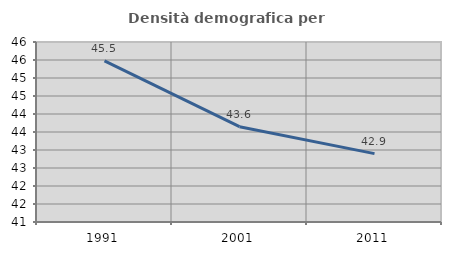
| Category | Densità demografica |
|---|---|
| 1991.0 | 45.478 |
| 2001.0 | 43.648 |
| 2011.0 | 42.899 |